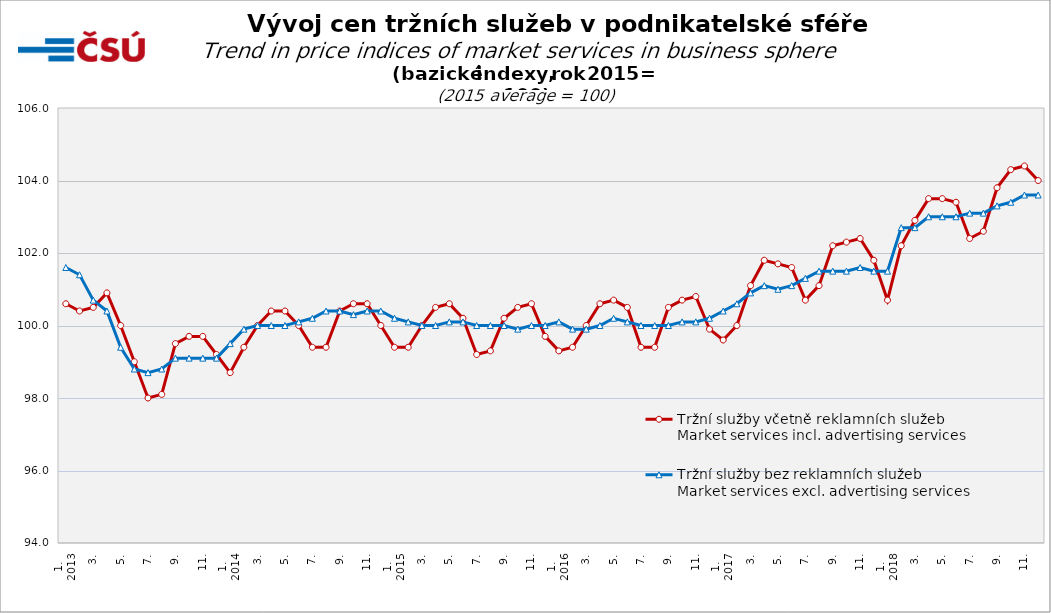
| Category | Tržní služby včetně reklamních služeb
Market services incl. advertising services | Tržní služby bez reklamních služeb
Market services excl. advertising services |
|---|---|---|
| 0 | 100.6 | 101.6 |
| 1 | 100.4 | 101.4 |
| 2 | 100.5 | 100.7 |
| 3 | 100.9 | 100.4 |
| 4 | 100 | 99.4 |
| 5 | 99 | 98.8 |
| 6 | 98 | 98.7 |
| 7 | 98.1 | 98.8 |
| 8 | 99.5 | 99.1 |
| 9 | 99.7 | 99.1 |
| 10 | 99.7 | 99.1 |
| 11 | 99.2 | 99.1 |
| 12 | 98.7 | 99.5 |
| 13 | 99.4 | 99.9 |
| 14 | 100 | 100 |
| 15 | 100.4 | 100 |
| 16 | 100.4 | 100 |
| 17 | 100 | 100.1 |
| 18 | 99.4 | 100.2 |
| 19 | 99.4 | 100.4 |
| 20 | 100.4 | 100.4 |
| 21 | 100.6 | 100.3 |
| 22 | 100.6 | 100.4 |
| 23 | 100 | 100.4 |
| 24 | 99.4 | 100.2 |
| 25 | 99.4 | 100.1 |
| 26 | 100 | 100 |
| 27 | 100.5 | 100 |
| 28 | 100.6 | 100.1 |
| 29 | 100.2 | 100.1 |
| 30 | 99.2 | 100 |
| 31 | 99.3 | 100 |
| 32 | 100.2 | 100 |
| 33 | 100.5 | 99.9 |
| 34 | 100.6 | 100 |
| 35 | 99.7 | 100 |
| 36 | 99.3 | 100.1 |
| 37 | 99.4 | 99.9 |
| 38 | 100 | 99.9 |
| 39 | 100.6 | 100 |
| 40 | 100.7 | 100.2 |
| 41 | 100.5 | 100.1 |
| 42 | 99.4 | 100 |
| 43 | 99.4 | 100 |
| 44 | 100.5 | 100 |
| 45 | 100.7 | 100.1 |
| 46 | 100.8 | 100.1 |
| 47 | 99.9 | 100.2 |
| 48 | 99.6 | 100.4 |
| 49 | 100 | 100.6 |
| 50 | 101.1 | 100.9 |
| 51 | 101.8 | 101.1 |
| 52 | 101.7 | 101 |
| 53 | 101.6 | 101.1 |
| 54 | 100.7 | 101.3 |
| 55 | 101.1 | 101.5 |
| 56 | 102.2 | 101.5 |
| 57 | 102.3 | 101.5 |
| 58 | 102.4 | 101.6 |
| 59 | 101.8 | 101.5 |
| 60 | 100.7 | 101.5 |
| 61 | 102.2 | 102.7 |
| 62 | 102.9 | 102.7 |
| 63 | 103.5 | 103 |
| 64 | 103.5 | 103 |
| 65 | 103.4 | 103 |
| 66 | 102.4 | 103.1 |
| 67 | 102.6 | 103.1 |
| 68 | 103.8 | 103.3 |
| 69 | 104.3 | 103.4 |
| 70 | 104.4 | 103.6 |
| 71 | 104 | 103.6 |